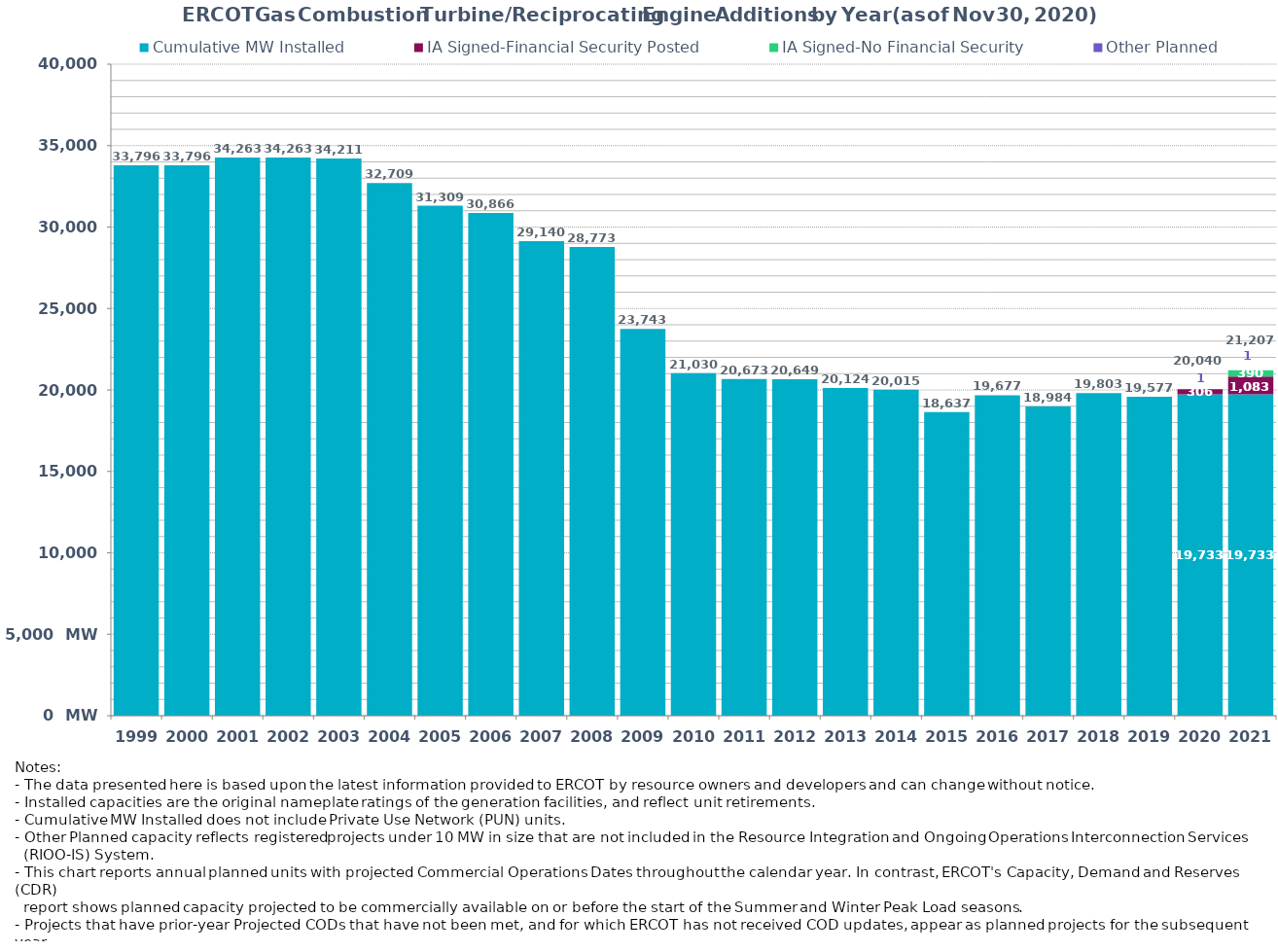
| Category | Cumulative MW Installed | Cumulative MW Synchronized | IA Signed-Financial Security Posted  | IA Signed-No Financial Security  | Other Planned | Cumulative Installed and Planned |
|---|---|---|---|---|---|---|
| 1999.0 | 33796.03 | 0 | 0 | 0 | 0 | 33796.03 |
| 2000.0 | 33796.03 | 0 | 0 | 0 | 0 | 33796.03 |
| 2001.0 | 34262.59 | 0 | 0 | 0 | 0 | 34262.59 |
| 2002.0 | 34262.59 | 0 | 0 | 0 | 0 | 34262.59 |
| 2003.0 | 34210.59 | 0 | 0 | 0 | 0 | 34210.59 |
| 2004.0 | 32708.69 | 0 | 0 | 0 | 0 | 32708.69 |
| 2005.0 | 31309.49 | 0 | 0 | 0 | 0 | 31309.49 |
| 2006.0 | 30866.49 | 0 | 0 | 0 | 0 | 30866.49 |
| 2007.0 | 29140.49 | 0 | 0 | 0 | 0 | 29140.49 |
| 2008.0 | 28773.29 | 0 | 0 | 0 | 0 | 28773.29 |
| 2009.0 | 23743.29 | 0 | 0 | 0 | 0 | 23743.29 |
| 2010.0 | 21030.17 | 0 | 0 | 0 | 0 | 21030.17 |
| 2011.0 | 20673.47 | 0 | 0 | 0 | 0 | 20673.47 |
| 2012.0 | 20649.47 | 0 | 0 | 0 | 0 | 20649.47 |
| 2013.0 | 20124.47 | 0 | 0 | 0 | 0 | 20124.47 |
| 2014.0 | 20015.47 | 0 | 0 | 0 | 0 | 20015.47 |
| 2015.0 | 18636.67 | 0 | 0 | 0 | 0 | 18636.67 |
| 2016.0 | 19677.05 | 0 | 0 | 0 | 0 | 19677.05 |
| 2017.0 | 18984.19 | 0 | 0 | 0 | 0 | 18984.19 |
| 2018.0 | 19803.35 | 0 | 0 | 0 | 0 | 19803.35 |
| 2019.0 | 19577.05 | 0 | 0 | 0 | 0 | 19577.05 |
| 2020.0 | 19732.64 | 0 | 306 | 0 | 1.3 | 20039.94 |
| 2021.0 | 19732.64 | 0 | 1083 | 390 | 1.3 | 21206.94 |